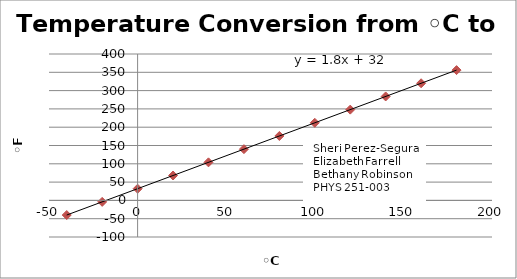
| Category | ◦F |
|---|---|
| -40.0 | -40 |
| -20.0 | -4 |
| 0.0 | 32 |
| 20.0 | 68 |
| 40.0 | 104 |
| 60.0 | 140 |
| 80.0 | 176 |
| 100.0 | 212 |
| 120.0 | 248 |
| 140.0 | 284 |
| 160.0 | 320 |
| 180.0 | 356 |